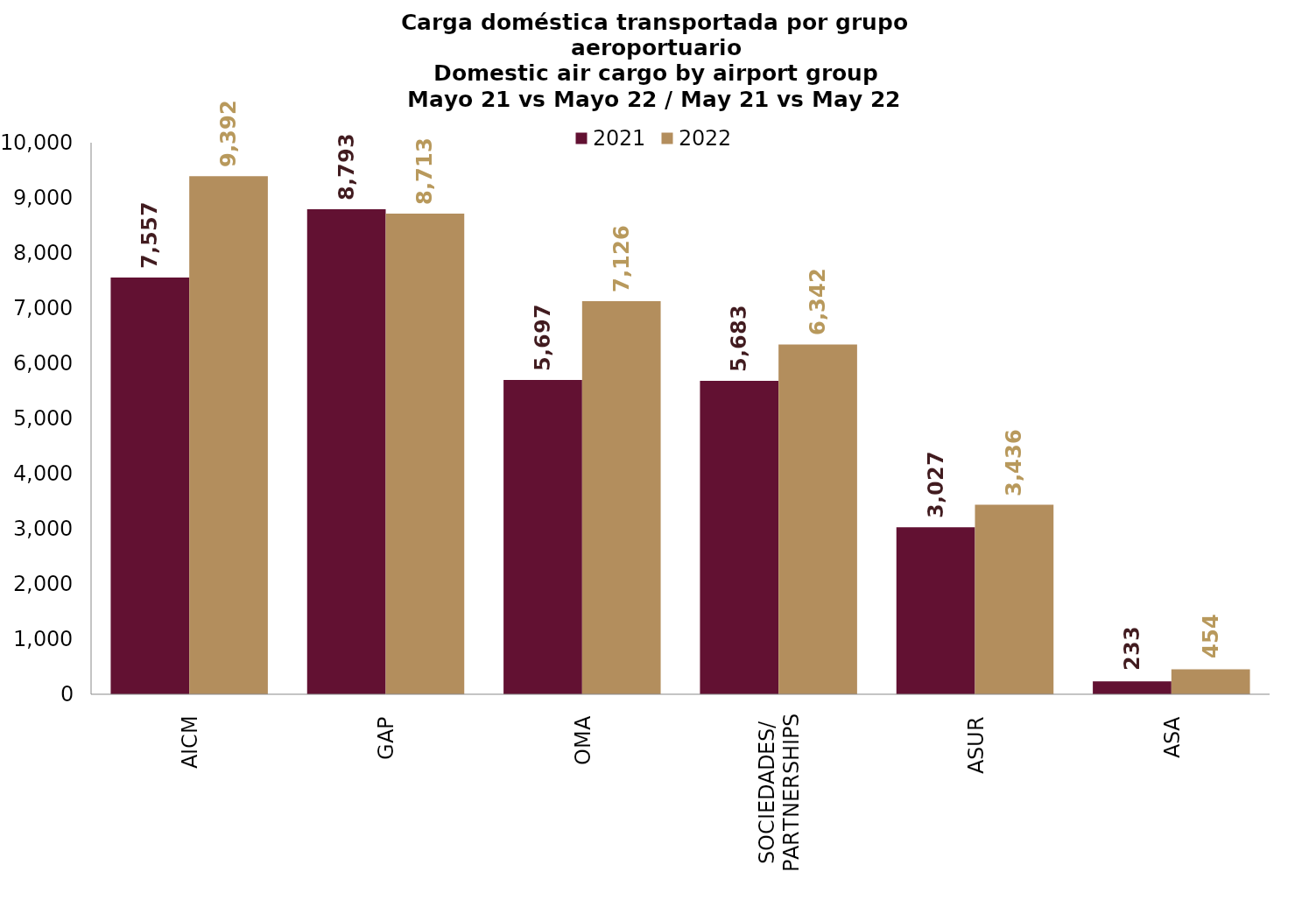
| Category | 2021 | 2022 |
|---|---|---|
| AICM | 7557.3 | 9392.057 |
| GAP | 8792.838 | 8712.752 |
| OMA | 5697.27 | 7126.237 |
| SOCIEDADES/
PARTNERSHIPS | 5683.146 | 6342.406 |
| ASUR | 3027.429 | 3435.625 |
| ASA | 232.945 | 453.809 |